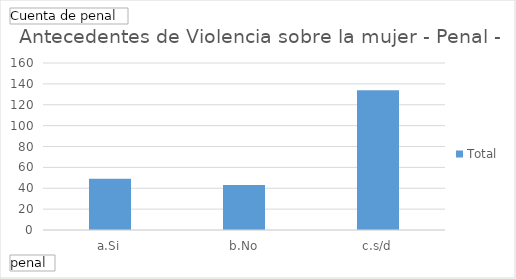
| Category | Total |
|---|---|
| a.Si | 49 |
| b.No | 43 |
| c.s/d | 134 |